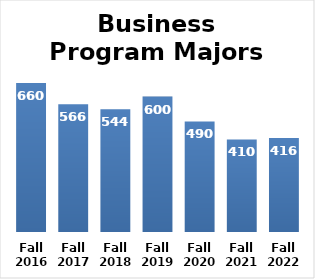
| Category | Series 0 |
|---|---|
| Fall 2016 | 660 |
| Fall 2017 | 566 |
| Fall 2018 | 544 |
| Fall 2019 | 600 |
| Fall 2020 | 490 |
| Fall 2021 | 410 |
| Fall 2022 | 416 |